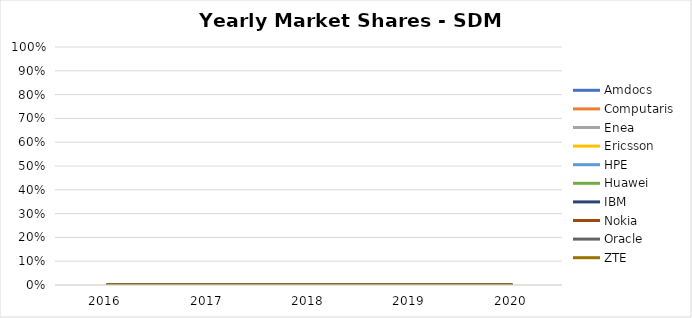
| Category | Amdocs | Computaris | Enea | Ericsson | HPE | Huawei | IBM | Nokia | Oracle | ZTE |
|---|---|---|---|---|---|---|---|---|---|---|
| 2016.0 | 0 | 0 | 0 | 0 | 0 | 0 | 0 | 0 | 0 | 0 |
| 2017.0 | 0 | 0 | 0 | 0 | 0 | 0 | 0 | 0 | 0 | 0 |
| 2018.0 | 0 | 0 | 0 | 0 | 0 | 0 | 0 | 0 | 0 | 0 |
| 2019.0 | 0 | 0 | 0 | 0 | 0 | 0 | 0 | 0 | 0 | 0 |
| 2020.0 | 0 | 0 | 0 | 0 | 0 | 0 | 0 | 0 | 0 | 0 |